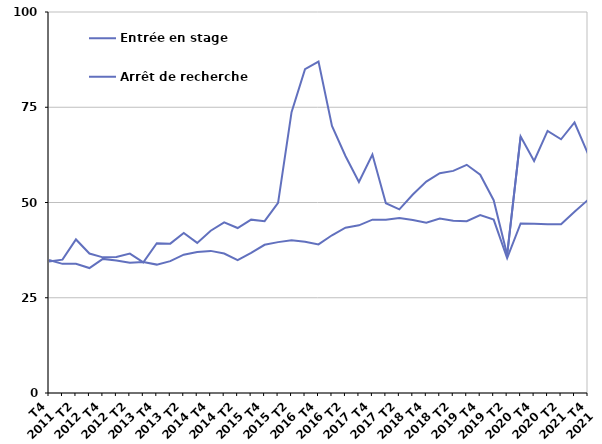
| Category | Entrée en stage | Arrêt de recherche |
|---|---|---|
| T4
2011 | 34.5 | 34.9 |
| T1
2012 | 35 | 33.9 |
| T2
2012 | 40.3 | 33.9 |
| T3
2012 | 36.6 | 32.8 |
| T4
2012 | 35.6 | 35.2 |
| T1
2013 | 35.7 | 34.8 |
| T2
2013 | 36.6 | 34.2 |
| T3
2013 | 34.3 | 34.4 |
| T4
2013 | 39.3 | 33.7 |
| T1
2014 | 39.2 | 34.6 |
| T2
2014 | 42 | 36.3 |
| T3
2014 | 39.4 | 37 |
| T4
2014 | 42.6 | 37.3 |
| T1
2015 | 44.8 | 36.6 |
| T2
2015 | 43.3 | 34.9 |
| T3
2015 | 45.5 | 36.8 |
| T4
2015 | 45.1 | 38.9 |
| T1
2016 | 49.9 | 39.6 |
| T2
2016 | 73.7 | 40.1 |
| T3
2016 | 85 | 39.7 |
| T4
2016 | 87 | 39 |
| T1
2017 | 70.1 | 41.4 |
| T2
2017 | 62.2 | 43.4 |
| T3
2017 | 55.4 | 44 |
| T4
2017 | 62.6 | 45.5 |
| T1
2018 | 49.8 | 45.5 |
| T2
2018 | 48.2 | 45.9 |
| T3
2018 | 52.1 | 45.4 |
| T4
2018 | 55.5 | 44.7 |
| T1
2019 | 57.7 | 45.8 |
| T2
2019 | 58.3 | 45.2 |
| T3
2019 | 59.9 | 45.1 |
| T4
2019 | 57.3 | 46.7 |
| T1
2020 | 50.6 | 45.5 |
| T2
2020 | 36.3 | 35.4 |
| T3
2020 | 67.3 | 44.5 |
| T4
2020 | 60.9 | 44.4 |
| T1
2021 | 68.8 | 44.3 |
| T2
2021 | 66.6 | 44.3 |
| T3
2021 | 71 | 47.6 |
| T4
2021 | 62.8 | 50.7 |